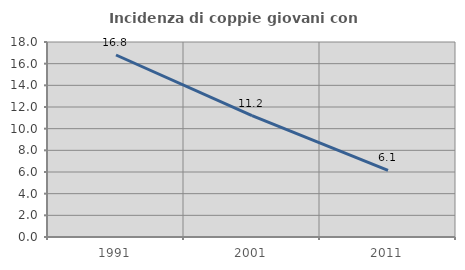
| Category | Incidenza di coppie giovani con figli |
|---|---|
| 1991.0 | 16.8 |
| 2001.0 | 11.194 |
| 2011.0 | 6.14 |